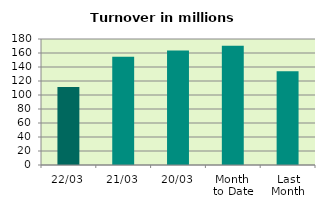
| Category | Series 0 |
|---|---|
| 22/03 | 111.602 |
| 21/03 | 154.605 |
| 20/03 | 163.459 |
| Month 
to Date | 170.325 |
| Last
Month | 133.846 |